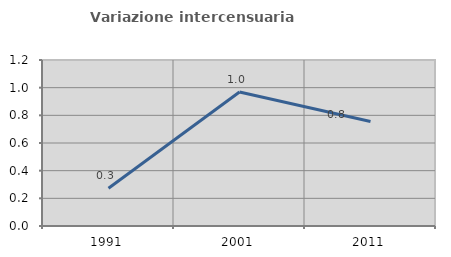
| Category | Variazione intercensuaria annua |
|---|---|
| 1991.0 | 0.273 |
| 2001.0 | 0.969 |
| 2011.0 | 0.755 |